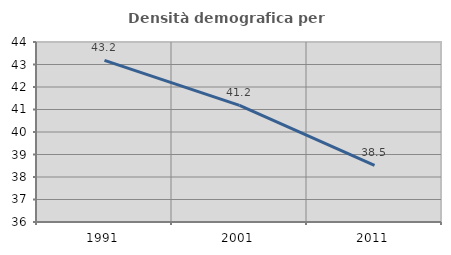
| Category | Densità demografica |
|---|---|
| 1991.0 | 43.186 |
| 2001.0 | 41.181 |
| 2011.0 | 38.521 |